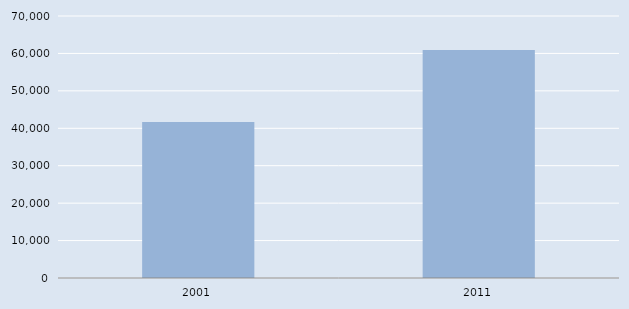
| Category | Series 0 |
|---|---|
| 2001.0 | 41690 |
| 2011.0 | 60897 |